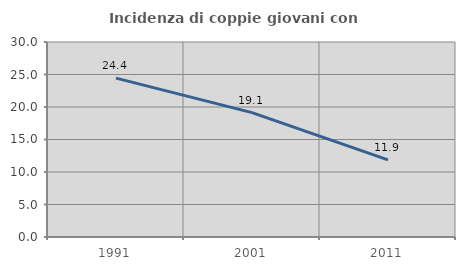
| Category | Incidenza di coppie giovani con figli |
|---|---|
| 1991.0 | 24.443 |
| 2001.0 | 19.136 |
| 2011.0 | 11.873 |